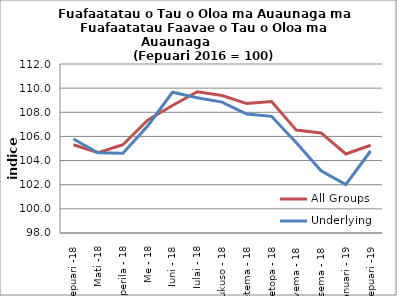
| Category | All Groups | Underlying |
|---|---|---|
| Fepuari -18 | 105.308 | 105.79 |
| Mati -18 | 104.655 | 104.651 |
| Aperila - 18 | 105.309 | 104.614 |
| Me - 18 | 107.355 | 106.863 |
| Iuni - 18 | 108.567 | 109.659 |
| Iulai - 18 | 109.702 | 109.198 |
| Aukuso - 18 | 109.392 | 108.845 |
| Setema - 18 | 108.722 | 107.857 |
| Oketopa - 18 | 108.895 | 107.664 |
| Novema - 18 | 106.524 | 105.471 |
| Tesema - 18 | 106.292 | 103.148 |
| Ianuari - 19 | 104.55 | 102.019 |
| Fepuari -19 | 105.272 | 104.794 |